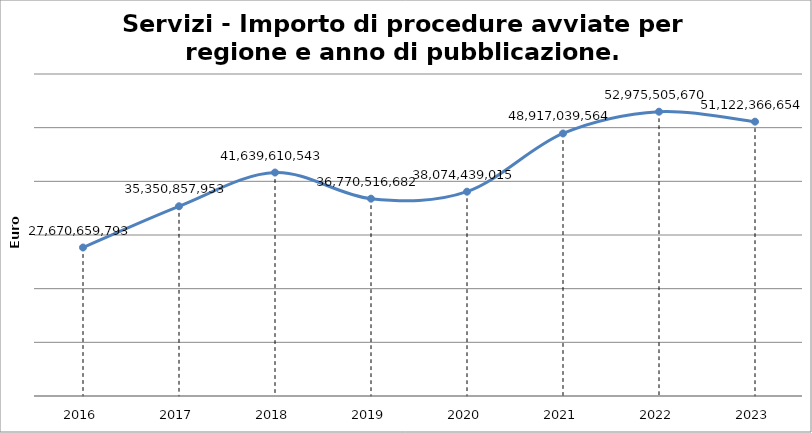
| Category | Totale |
|---|---|
| 2016.0 | 27670659793 |
| 2017.0 | 35350857953 |
| 2018.0 | 41639610543 |
| 2019.0 | 36770516682 |
| 2020.0 | 38074439015 |
| 2021.0 | 48917039564 |
| 2022.0 | 52975505670 |
| 2023.0 | 51122366654 |